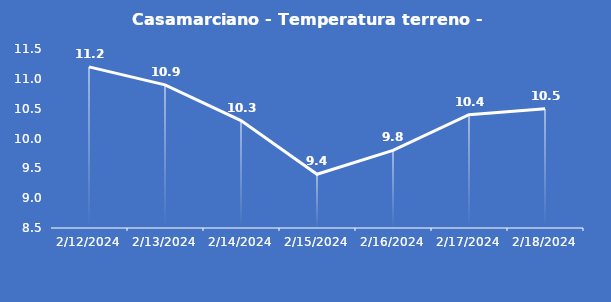
| Category | Casamarciano - Temperatura terreno - Grezzo (°C) |
|---|---|
| 2/12/24 | 11.2 |
| 2/13/24 | 10.9 |
| 2/14/24 | 10.3 |
| 2/15/24 | 9.4 |
| 2/16/24 | 9.8 |
| 2/17/24 | 10.4 |
| 2/18/24 | 10.5 |